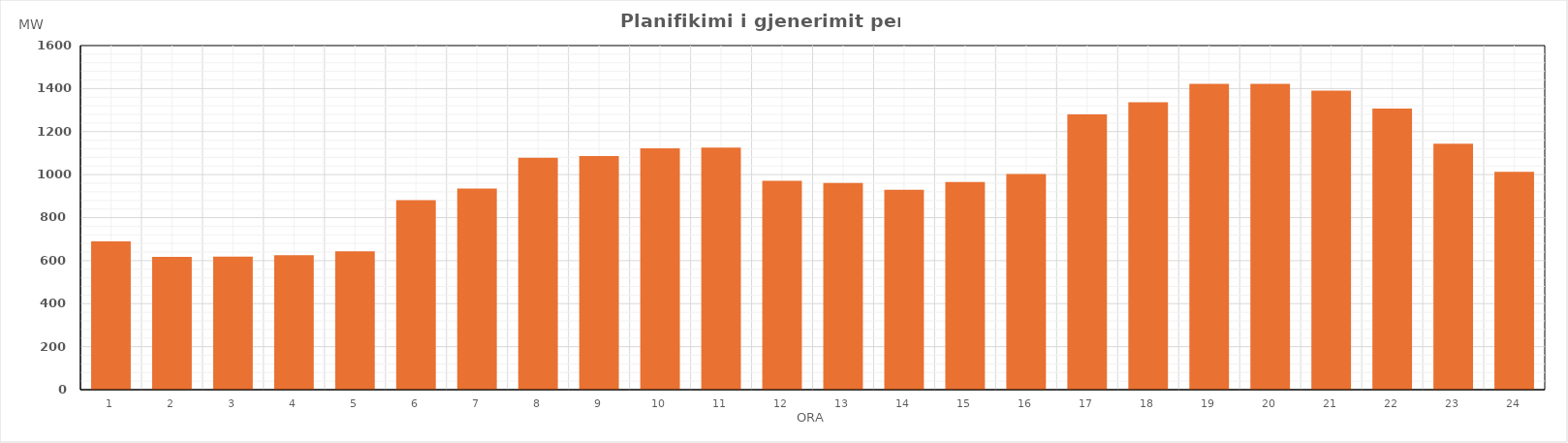
| Category | Max (MW) |
|---|---|
| 0 | 689.99 |
| 1 | 617.79 |
| 2 | 618.67 |
| 3 | 625.37 |
| 4 | 643.86 |
| 5 | 881.01 |
| 6 | 935.35 |
| 7 | 1078.64 |
| 8 | 1086.58 |
| 9 | 1122.69 |
| 10 | 1125.63 |
| 11 | 971.65 |
| 12 | 961.31 |
| 13 | 929.75 |
| 14 | 965.63 |
| 15 | 1002.53 |
| 16 | 1279.76 |
| 17 | 1336.52 |
| 18 | 1421.89 |
| 19 | 1422.46 |
| 20 | 1390 |
| 21 | 1307.32 |
| 22 | 1143.22 |
| 23 | 1012.63 |